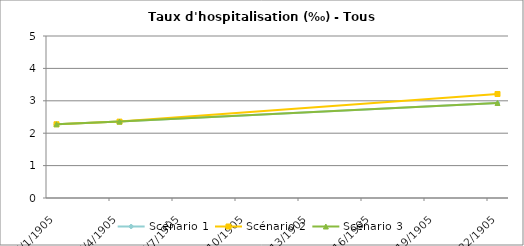
| Category | Scénario 1 | Scénario 2 | Scénario 3 |
|---|---|---|---|
| 2009.0 | 2.275 | 2.275 | 2.275 |
| 2012.0 | 2.357 | 2.357 | 2.357 |
| 2030.0 | 2.933 | 3.21 | 2.933 |